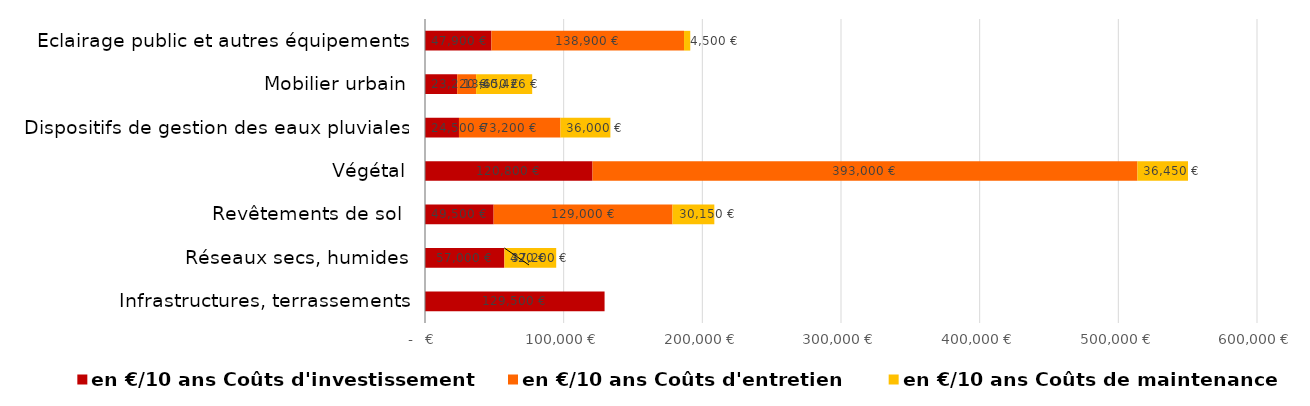
| Category | Series 0 | Series 1 | Series 2 |
|---|---|---|---|
| Infrastructures, terrassements | 129500 | 0 | 0 |
| Réseaux secs, humides | 57000 | 420 | 37200 |
| Revêtements de sol  | 49500 | 129000 | 30150 |
| Végétal | 120800 | 393000 | 36450 |
| Dispositifs de gestion des eaux pluviales | 24500 | 73200 | 36000 |
| Mobilier urbain | 23220 | 13650 | 40425.9 |
| Eclairage public et autres équipements | 47900 | 138900 | 4500.39 |